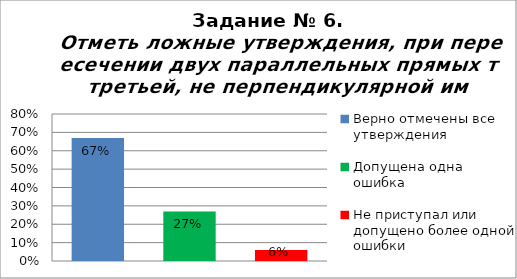
| Category | Отметь ложные утверждения, при пересечении двух параллельных прямых третьей, не перпендикулярной им. |
|---|---|
| Верно отмечены все утверждения | 0.67 |
| Допущена одна ошибка | 0.27 |
| Не приступал или допущено более одной ошибки | 0.06 |